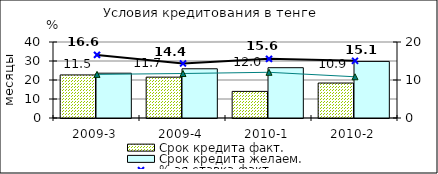
| Category | Срок кредита факт.  | Срок кредита желаем. |
|---|---|---|
| 2009-3 | 22.67 | 23.58 |
| 2009-4 | 21.5 | 25.91 |
| 2010-1 | 14 | 26.48 |
| 2010-2 | 18.4 | 29.78 |